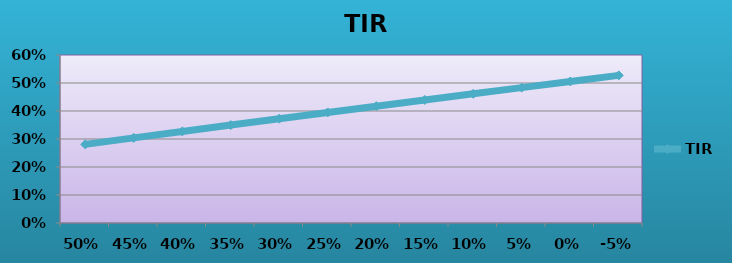
| Category | TIR |
|---|---|
| 0.5 | 0.281 |
| 0.45 | 0.304 |
| 0.4 | 0.327 |
| 0.35 | 0.35 |
| 0.3 | 0.372 |
| 0.25 | 0.395 |
| 0.2 | 0.417 |
| 0.15 | 0.439 |
| 0.1 | 0.462 |
| 0.05 | 0.484 |
| 0.0 | 0.505 |
| -0.05 | 0.527 |